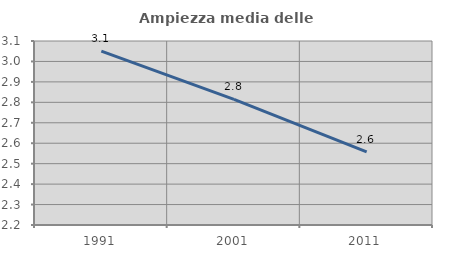
| Category | Ampiezza media delle famiglie |
|---|---|
| 1991.0 | 3.051 |
| 2001.0 | 2.815 |
| 2011.0 | 2.557 |